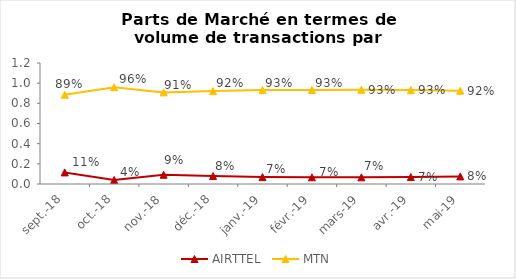
| Category | AIRTTEL | MTN |
|---|---|---|
| 2018-09-01 | 0.115 | 0.885 |
| 2018-10-01 | 0.04 | 0.96 |
| 2018-11-01 | 0.091 | 0.909 |
| 2018-12-01 | 0.079 | 0.921 |
| 2019-01-01 | 0.068 | 0.932 |
| 2019-02-01 | 0.067 | 0.933 |
| 2019-03-01 | 0.066 | 0.934 |
| 2019-04-01 | 0.069 | 0.931 |
| 2019-05-01 | 0.075 | 0.925 |